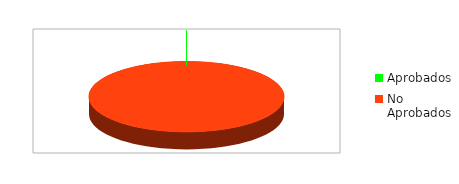
| Category | Número |
|---|---|
| Aprobados | 0 |
| No Aprobados | 113 |
| No Aplican | 0 |